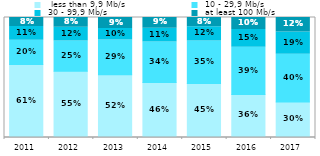
| Category |   less than 9,9 Mb/s |  10 - 29,9 Mb/s |  30 - 99,9 Mb/s |  at least 100 Mb/s  |
|---|---|---|---|---|
| 2011.0 | 0.608 | 0.202 | 0.114 | 0.076 |
| 2012.0 | 0.552 | 0.252 | 0.115 | 0.081 |
| 2013.0 | 0.522 | 0.291 | 0.095 | 0.092 |
| 2014.0 | 0.458 | 0.338 | 0.114 | 0.09 |
| 2015.0 | 0.451 | 0.353 | 0.119 | 0.077 |
| 2016.0 | 0.359 | 0.393 | 0.147 | 0.101 |
| 2017.0 | 0.295 | 0.399 | 0.185 | 0.121 |